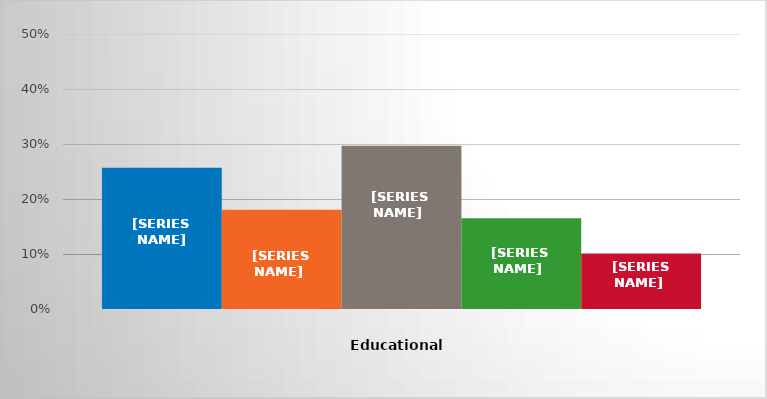
| Category | GED/High school diploma | Less than 1 year of college | 1 year of college | 2 years of college | Other |
|---|---|---|---|---|---|
| 0 | 0.257 | 0.18 | 0.297 | 0.165 | 0.101 |